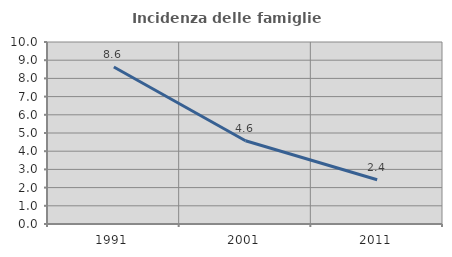
| Category | Incidenza delle famiglie numerose |
|---|---|
| 1991.0 | 8.625 |
| 2001.0 | 4.576 |
| 2011.0 | 2.433 |